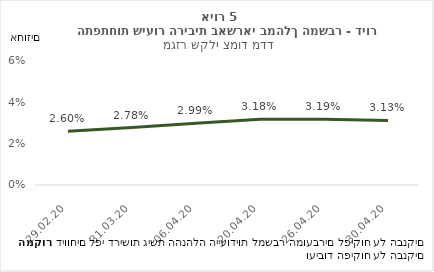
| Category | דיור-צמוד |
|---|---|
| 29.02.20 | 0.026 |
| 31.03.20 | 0.028 |
| 06.04.20 | 0.03 |
| 20.04.20 | 0.032 |
| 26.04.20 | 0.032 |
| 30.04.20 | 0.031 |